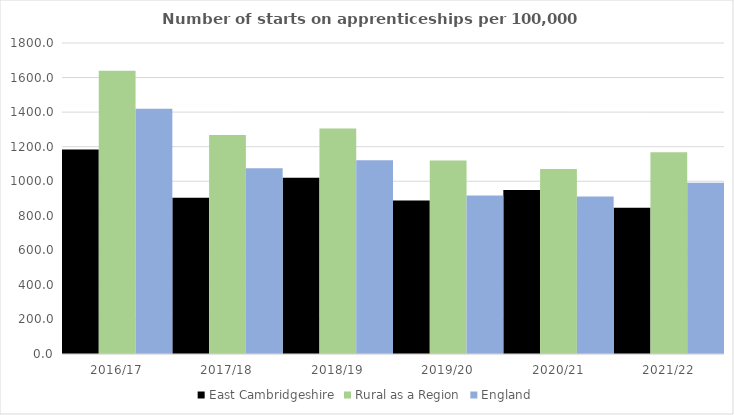
| Category | East Cambridgeshire | Rural as a Region | England |
|---|---|---|---|
| 2016/17 | 1183 | 1638.789 | 1420 |
| 2017/18 | 904 | 1267.474 | 1075 |
| 2018/19 | 1020 | 1304.57 | 1122 |
| 2019/20 | 888 | 1119.662 | 918 |
| 2020/21 | 949 | 1070.748 | 912 |
| 2021/22 | 847 | 1167.68 | 991 |